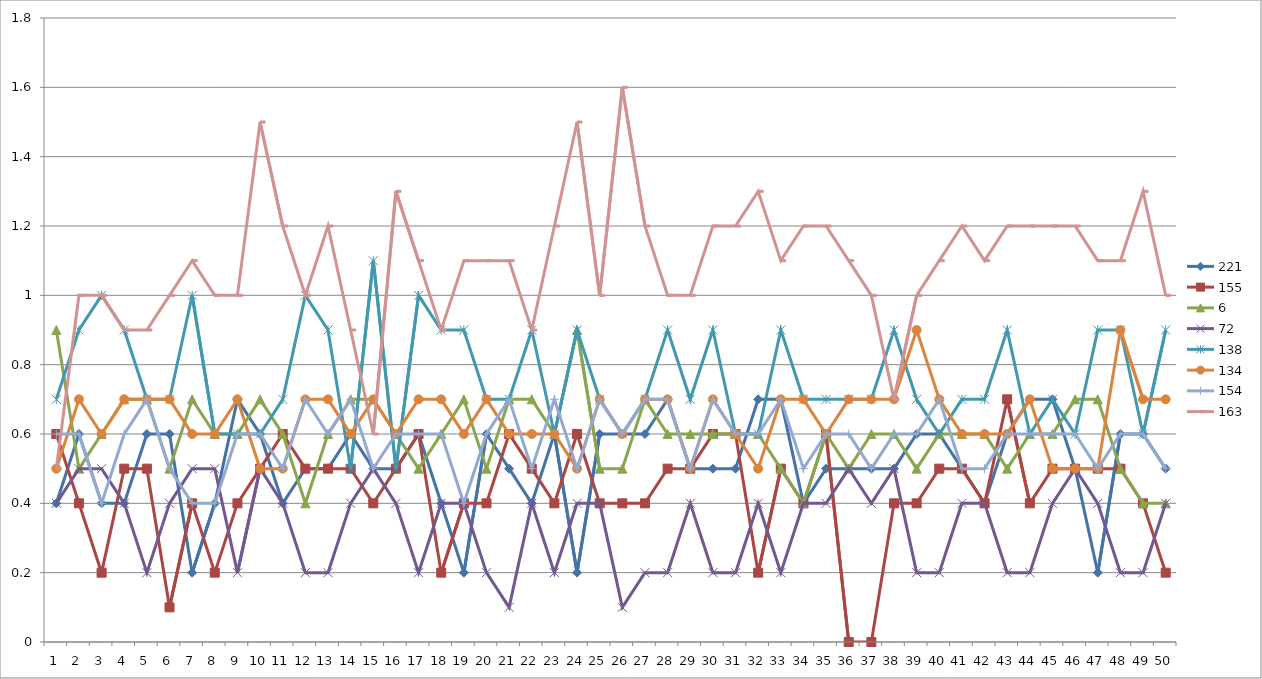
| Category | 221 | 155 | 6 | 72 | 138 | 134 | 154 | 163 |
|---|---|---|---|---|---|---|---|---|
| 0 | 0.4 | 0.6 | 0.9 | 0.4 | 0.7 | 0.5 | 0.6 | 0.5 |
| 1 | 0.6 | 0.4 | 0.5 | 0.5 | 0.9 | 0.7 | 0.6 | 1 |
| 2 | 0.4 | 0.2 | 0.6 | 0.5 | 1 | 0.6 | 0.4 | 1 |
| 3 | 0.4 | 0.5 | 0.7 | 0.4 | 0.9 | 0.7 | 0.6 | 0.9 |
| 4 | 0.6 | 0.5 | 0.7 | 0.2 | 0.7 | 0.7 | 0.7 | 0.9 |
| 5 | 0.6 | 0.1 | 0.5 | 0.4 | 0.7 | 0.7 | 0.5 | 1 |
| 6 | 0.2 | 0.4 | 0.7 | 0.5 | 1 | 0.6 | 0.4 | 1.1 |
| 7 | 0.4 | 0.2 | 0.6 | 0.5 | 0.6 | 0.6 | 0.4 | 1 |
| 8 | 0.7 | 0.4 | 0.6 | 0.2 | 0.6 | 0.7 | 0.6 | 1 |
| 9 | 0.6 | 0.5 | 0.7 | 0.5 | 0.6 | 0.5 | 0.6 | 1.5 |
| 10 | 0.4 | 0.6 | 0.6 | 0.4 | 0.7 | 0.5 | 0.5 | 1.2 |
| 11 | 0.5 | 0.5 | 0.4 | 0.2 | 1 | 0.7 | 0.7 | 1 |
| 12 | 0.5 | 0.5 | 0.6 | 0.2 | 0.9 | 0.7 | 0.6 | 1.2 |
| 13 | 0.6 | 0.5 | 0.7 | 0.4 | 0.5 | 0.6 | 0.7 | 0.9 |
| 14 | 0.5 | 0.4 | 0.7 | 0.5 | 1.1 | 0.7 | 0.5 | 0.6 |
| 15 | 0.5 | 0.5 | 0.6 | 0.4 | 0.5 | 0.6 | 0.6 | 1.3 |
| 16 | 0.6 | 0.6 | 0.5 | 0.2 | 1 | 0.7 | 0.6 | 1.1 |
| 17 | 0.4 | 0.2 | 0.6 | 0.4 | 0.9 | 0.7 | 0.6 | 0.9 |
| 18 | 0.2 | 0.4 | 0.7 | 0.4 | 0.9 | 0.6 | 0.4 | 1.1 |
| 19 | 0.6 | 0.4 | 0.5 | 0.2 | 0.7 | 0.7 | 0.6 | 1.1 |
| 20 | 0.5 | 0.6 | 0.7 | 0.1 | 0.7 | 0.6 | 0.7 | 1.1 |
| 21 | 0.4 | 0.5 | 0.7 | 0.4 | 0.9 | 0.6 | 0.5 | 0.9 |
| 22 | 0.6 | 0.4 | 0.6 | 0.2 | 0.6 | 0.6 | 0.7 | 1.2 |
| 23 | 0.2 | 0.6 | 0.9 | 0.4 | 0.9 | 0.5 | 0.5 | 1.5 |
| 24 | 0.6 | 0.4 | 0.5 | 0.4 | 0.7 | 0.7 | 0.7 | 1 |
| 25 | 0.6 | 0.4 | 0.5 | 0.1 | 0.6 | 0.6 | 0.6 | 1.6 |
| 26 | 0.6 | 0.4 | 0.7 | 0.2 | 0.7 | 0.7 | 0.7 | 1.2 |
| 27 | 0.7 | 0.5 | 0.6 | 0.2 | 0.9 | 0.7 | 0.7 | 1 |
| 28 | 0.5 | 0.5 | 0.6 | 0.4 | 0.7 | 0.5 | 0.5 | 1 |
| 29 | 0.5 | 0.6 | 0.6 | 0.2 | 0.9 | 0.7 | 0.7 | 1.2 |
| 30 | 0.5 | 0.6 | 0.6 | 0.2 | 0.6 | 0.6 | 0.6 | 1.2 |
| 31 | 0.7 | 0.2 | 0.6 | 0.4 | 0.6 | 0.5 | 0.6 | 1.3 |
| 32 | 0.7 | 0.5 | 0.5 | 0.2 | 0.9 | 0.7 | 0.7 | 1.1 |
| 33 | 0.4 | 0.4 | 0.4 | 0.4 | 0.7 | 0.7 | 0.5 | 1.2 |
| 34 | 0.5 | 0.6 | 0.6 | 0.4 | 0.7 | 0.6 | 0.6 | 1.2 |
| 35 | 0.5 | 0 | 0.5 | 0.5 | 0.7 | 0.7 | 0.6 | 1.1 |
| 36 | 0.5 | 0 | 0.6 | 0.4 | 0.7 | 0.7 | 0.5 | 1 |
| 37 | 0.5 | 0.4 | 0.6 | 0.5 | 0.9 | 0.7 | 0.6 | 0.7 |
| 38 | 0.6 | 0.4 | 0.5 | 0.2 | 0.7 | 0.9 | 0.6 | 1 |
| 39 | 0.6 | 0.5 | 0.6 | 0.2 | 0.6 | 0.7 | 0.7 | 1.1 |
| 40 | 0.5 | 0.5 | 0.6 | 0.4 | 0.7 | 0.6 | 0.5 | 1.2 |
| 41 | 0.4 | 0.4 | 0.6 | 0.4 | 0.7 | 0.6 | 0.5 | 1.1 |
| 42 | 0.6 | 0.7 | 0.5 | 0.2 | 0.9 | 0.6 | 0.6 | 1.2 |
| 43 | 0.7 | 0.4 | 0.6 | 0.2 | 0.6 | 0.7 | 0.6 | 1.2 |
| 44 | 0.7 | 0.5 | 0.6 | 0.4 | 0.7 | 0.5 | 0.6 | 1.2 |
| 45 | 0.5 | 0.5 | 0.7 | 0.5 | 0.6 | 0.5 | 0.6 | 1.2 |
| 46 | 0.2 | 0.5 | 0.7 | 0.4 | 0.9 | 0.5 | 0.5 | 1.1 |
| 47 | 0.6 | 0.5 | 0.5 | 0.2 | 0.9 | 0.9 | 0.6 | 1.1 |
| 48 | 0.6 | 0.4 | 0.4 | 0.2 | 0.6 | 0.7 | 0.6 | 1.3 |
| 49 | 0.5 | 0.2 | 0.4 | 0.4 | 0.9 | 0.7 | 0.5 | 1 |